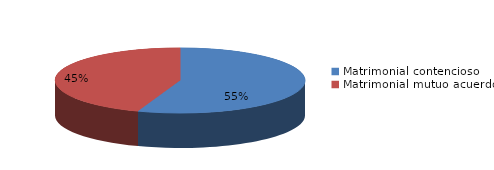
| Category | Series 0 |
|---|---|
| 0 | 1931 |
| 1 | 1552 |